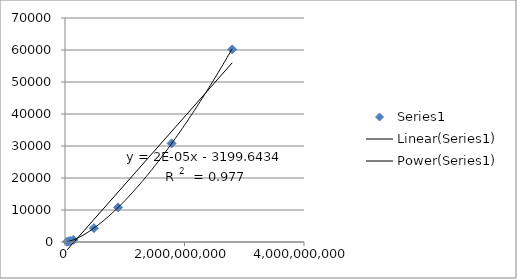
| Category | Series 0 |
|---|---|
| 35983610.0 | 88 |
| 67232360.0 | 224 |
| 92957100.0 | 365 |
| 141635300.0 | 686.97 |
| 483632000.0 | 4331 |
| 888188000.0 | 10832 |
| 1783950000.0 | 30799 |
| 2798842000.0 | 60190 |